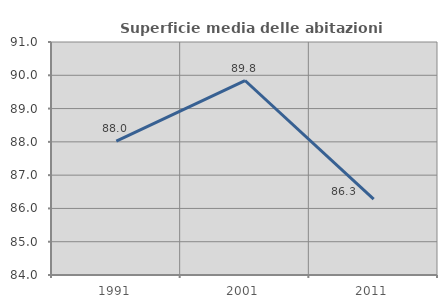
| Category | Superficie media delle abitazioni occupate |
|---|---|
| 1991.0 | 88.02 |
| 2001.0 | 89.843 |
| 2011.0 | 86.278 |